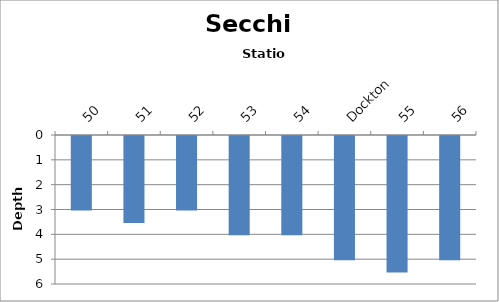
| Category | Series 0 |
|---|---|
| 50 | 3 |
| 51 | 3.5 |
| 52 | 3 |
| 53 | 4 |
| 54 | 4 |
| Dockton | 5 |
| 55 | 5.5 |
| 56 | 5 |